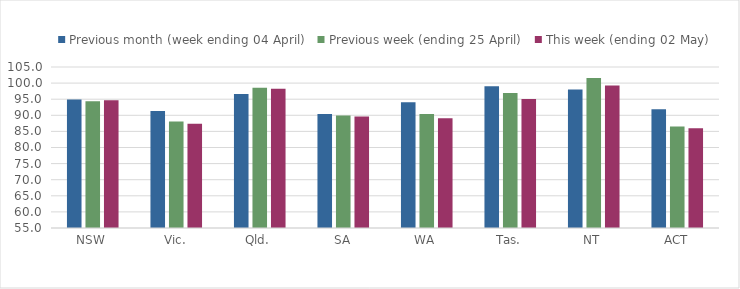
| Category | Previous month (week ending 04 April) | Previous week (ending 25 April) | This week (ending 02 May) |
|---|---|---|---|
| NSW | 94.887 | 94.369 | 94.659 |
| Vic. | 91.331 | 88.067 | 87.381 |
| Qld. | 96.599 | 98.532 | 98.216 |
| SA | 90.389 | 89.903 | 89.614 |
| WA | 94.082 | 90.37 | 89.077 |
| Tas. | 98.984 | 96.913 | 95.024 |
| NT | 97.976 | 101.6 | 99.28 |
| ACT | 91.865 | 86.517 | 85.955 |